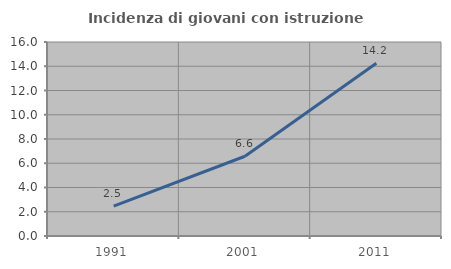
| Category | Incidenza di giovani con istruzione universitaria |
|---|---|
| 1991.0 | 2.459 |
| 2001.0 | 6.579 |
| 2011.0 | 14.241 |